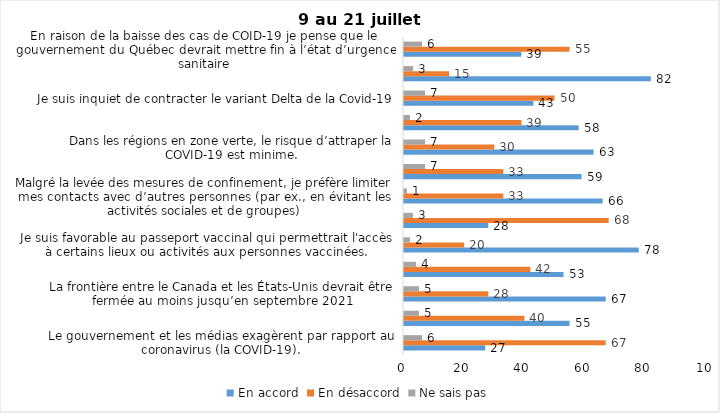
| Category | En accord | En désaccord | Ne sais pas |
|---|---|---|---|
| Le gouvernement et les médias exagèrent par rapport au coronavirus (la COVID-19). | 27 | 67 | 6 |
| J’ai peur que le système de santé soit débordé par les cas de COVID-19 suite au "déconfinement" | 55 | 40 | 5 |
| La frontière entre le Canada et les États-Unis devrait être fermée au moins jusqu’en septembre 2021 | 67 | 28 | 5 |
| Les personnes vaccinées contre la COVID-19 devraient avoir le droit de faire des rassemblements privés et de ne plus porter le masque dans les lieux publics. | 53 | 42 | 4 |
| Je suis favorable au passeport vaccinal qui permettrait l'accès à certains lieux ou activités aux personnes vaccinées. | 78 | 20 | 2 |
| Étant donné la progression de la vaccination et la diminution du nombre de cas de COVID-19, je pense qu’il est moins important de suivre les mesures de prévention. | 28 | 68 | 3 |
| Malgré la levée des mesures de confinement, je préfère limiter mes contacts avec d’autres personnes (par ex., en évitant les activités sociales et de groupes) | 66 | 33 | 1 |
| J’ai peur qu’il y ait une 4e vague de la COVID-19. | 59 | 33 | 7 |
| Dans les régions en zone verte, le risque d’attraper la COVID-19 est minime. | 63 | 30 | 7 |
| Si les cas de COVID-19 augmentent cet automne, je suis favorable à la mise en place de mesures de confinement (ex. fermeture de services non essentiels, interdiction des rassemblements privés) | 58 | 39 | 2 |
| Je suis inquiet de contracter le variant Delta de la Covid-19 | 43 | 50 | 7 |
| Je suis confiant que la vaccination protège efficacement contre les variants de la COVID-19 | 82 | 15 | 3 |
| En raison de la baisse des cas de COID-19 je pense que le gouvernement du Québec devrait mettre fin à l’état d’urgence sanitaire | 39 | 55 | 6 |